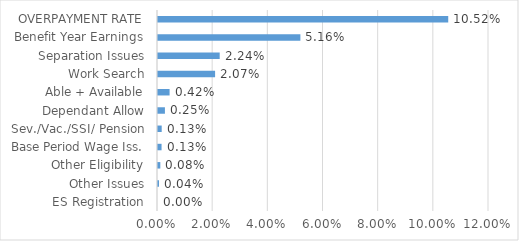
| Category | Series 0 |
|---|---|
| ES Registration | 0 |
| Other Issues | 0 |
| Other Eligibility | 0.001 |
| Base Period Wage Iss. | 0.001 |
| Sev./Vac./SSI/ Pension | 0.001 |
| Dependant Allow | 0.003 |
| Able + Available | 0.004 |
| Work Search | 0.021 |
| Separation Issues | 0.022 |
| Benefit Year Earnings | 0.052 |
| OVERPAYMENT RATE | 0.105 |